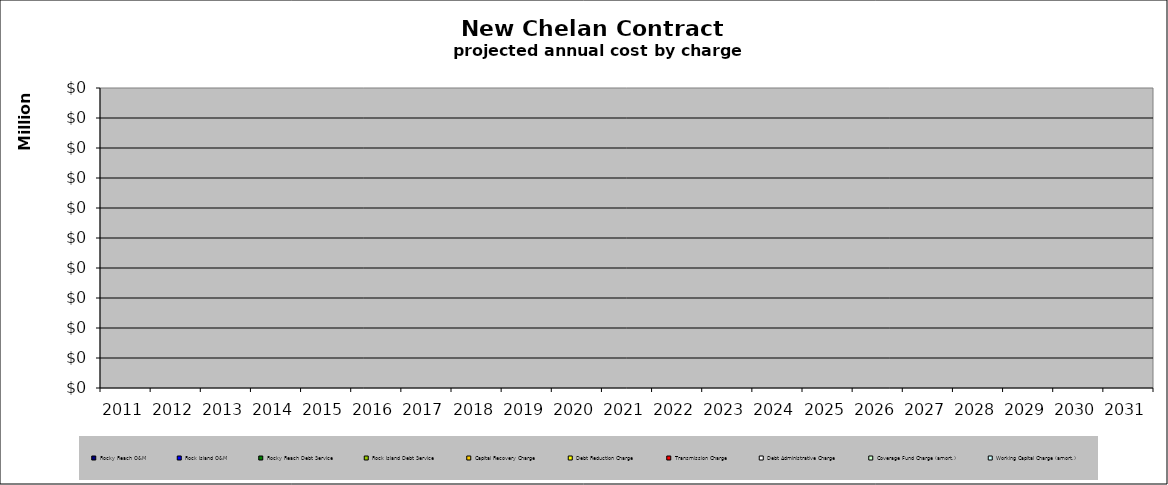
| Category | Rocky Reach O&M | Rock Island O&M | Rocky Reach Debt Service | Rock Island Debt Service | Capital Recovery Charge | Debt Reduction Charge | Transmission Charge | Debt Administrative Charge | Coverage Fund Charge (amort.) | Working Capital Charge (amort.) |
|---|---|---|---|---|---|---|---|---|---|---|
| 2011.0 | 0 | 0 | 0 | 0 | 0 | 0 | 0 | 0 | 0 | 0 |
| 2012.0 | 0 | 0 | 0 | 0 | 0 | 0 | 0 | 0 | 0 | 0 |
| 2013.0 | 0 | 0 | 0 | 0 | 0 | 0 | 0 | 0 | 0 | 0 |
| 2014.0 | 0 | 0 | 0 | 0 | 0 | 0 | 0 | 0 | 0 | 0 |
| 2015.0 | 0 | 0 | 0 | 0 | 0 | 0 | 0 | 0 | 0 | 0 |
| 2016.0 | 0 | 0 | 0 | 0 | 0 | 0 | 0 | 0 | 0 | 0 |
| 2017.0 | 0 | 0 | 0 | 0 | 0 | 0 | 0 | 0 | 0 | 0 |
| 2018.0 | 0 | 0 | 0 | 0 | 0 | 0 | 0 | 0 | 0 | 0 |
| 2019.0 | 0 | 0 | 0 | 0 | 0 | 0 | 0 | 0 | 0 | 0 |
| 2020.0 | 0 | 0 | 0 | 0 | 0 | 0 | 0 | 0 | 0 | 0 |
| 2021.0 | 0 | 0 | 0 | 0 | 0 | 0 | 0 | 0 | 0 | 0 |
| 2022.0 | 0 | 0 | 0 | 0 | 0 | 0 | 0 | 0 | 0 | 0 |
| 2023.0 | 0 | 0 | 0 | 0 | 0 | 0 | 0 | 0 | 0 | 0 |
| 2024.0 | 0 | 0 | 0 | 0 | 0 | 0 | 0 | 0 | 0 | 0 |
| 2025.0 | 0 | 0 | 0 | 0 | 0 | 0 | 0 | 0 | 0 | 0 |
| 2026.0 | 0 | 0 | 0 | 0 | 0 | 0 | 0 | 0 | 0 | 0 |
| 2027.0 | 0 | 0 | 0 | 0 | 0 | 0 | 0 | 0 | 0 | 0 |
| 2028.0 | 0 | 0 | 0 | 0 | 0 | 0 | 0 | 0 | 0 | 0 |
| 2029.0 | 0 | 0 | 0 | 0 | 0 | 0 | 0 | 0 | 0 | 0 |
| 2030.0 | 0 | 0 | 0 | 0 | 0 | 0 | 0 | 0 | 0 | 0 |
| 2031.0 | 0 | 0 | 0 | 0 | 0 | 0 | 0 | 0 | 0 | 0 |